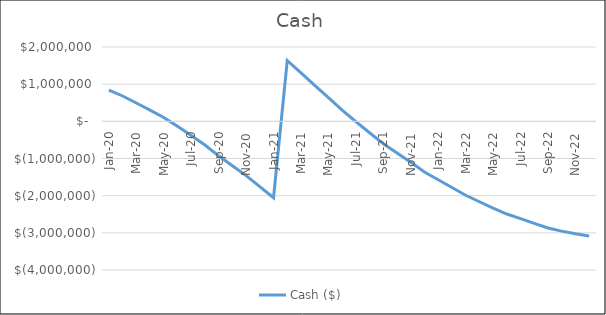
| Category | Cash ($) |
|---|---|
| 2020-01-01 | 841632.5 |
| 2020-02-29 | 681668.459 |
| 2020-03-31 | 492760.856 |
| 2020-04-30 | 300919.709 |
| 2020-05-31 | 102201.25 |
| 2020-06-30 | -134587.962 |
| 2020-07-31 | -381108.382 |
| 2020-08-31 | -636375.925 |
| 2020-09-30 | -927800.265 |
| 2020-10-31 | -1194435.394 |
| 2020-11-30 | -1460467.149 |
| 2020-12-31 | -1754784.846 |
| 2021-01-31 | -2055666.129 |
| 2021-02-28 | 1636790.785 |
| 2021-03-31 | 1301896.236 |
| 2021-04-30 | 966396.112 |
| 2021-05-31 | 640141.625 |
| 2021-06-30 | 303270.503 |
| 2021-07-31 | -6179.413 |
| 2021-08-31 | -306987.496 |
| 2021-09-30 | -601720.015 |
| 2021-10-31 | -850678.885 |
| 2021-11-30 | -1103569.201 |
| 2021-12-31 | -1361553.429 |
| 2022-01-31 | -1572406.073 |
| 2022-02-28 | -1778911.244 |
| 2022-03-31 | -1988714.631 |
| 2022-04-30 | -2163753.336 |
| 2022-05-31 | -2333589.397 |
| 2022-06-30 | -2493401.212 |
| 2022-07-31 | -2619227.795 |
| 2022-08-31 | -2743418.847 |
| 2022-09-30 | -2870812.708 |
| 2022-10-31 | -2953898.385 |
| 2022-11-30 | -3024824.568 |
| 2022-12-31 | -3085279.358 |